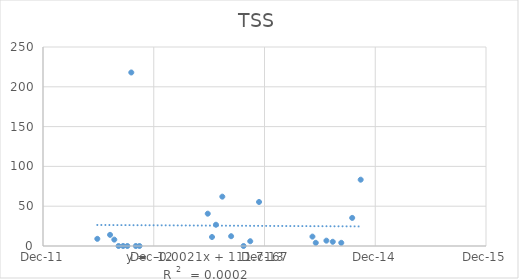
| Category | Series 0 |
|---|---|
| 41059.0 | 9 |
| 41101.0 | 14 |
| 41115.0 | 8 |
| 41129.0 | 0 |
| 41144.0 | 0 |
| 41158.0 | 0 |
| 41171.0 | 218 |
| 41186.0 | 0 |
| 41198.0 | 0 |
| 41423.0 | 40.6 |
| 41437.0 | 11.3 |
| 41450.0 | 26.7 |
| 41471.0 | 62 |
| 41500.0 | 12.3 |
| 41541.0 | 0 |
| 41563.0 | 6 |
| 41592.0 | 55.3 |
| 41768.0 | 11.8 |
| 41779.0 | 4 |
| 41814.0 | 6.7 |
| 41835.0 | 5.3 |
| 41863.0 | 4 |
| 41899.0 | 35.3 |
| 41927.0 | 83.3 |